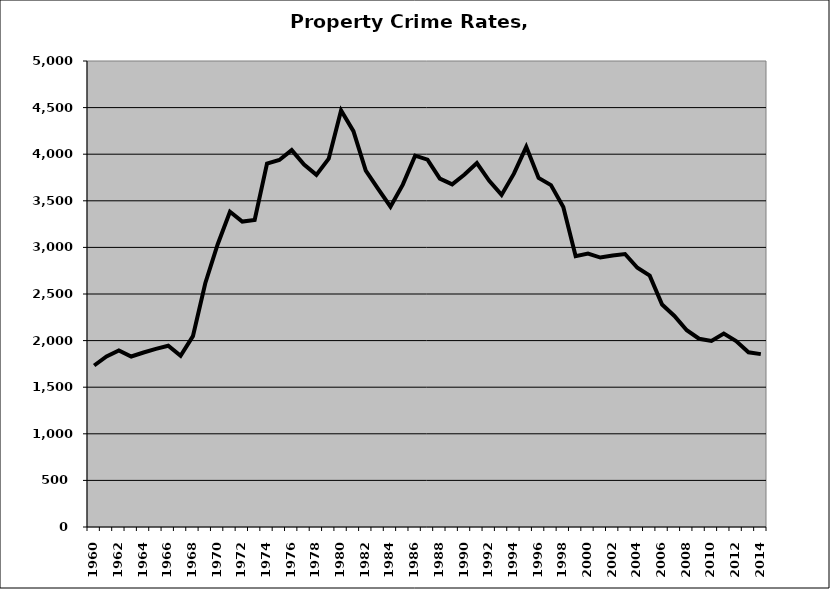
| Category | Property |
|---|---|
| 1960.0 | 1732.787 |
| 1961.0 | 1829.825 |
| 1962.0 | 1894.986 |
| 1963.0 | 1829.453 |
| 1964.0 | 1872.11 |
| 1965.0 | 1911.272 |
| 1966.0 | 1944.957 |
| 1967.0 | 1837.339 |
| 1968.0 | 2047.943 |
| 1969.0 | 2616.017 |
| 1970.0 | 3031.523 |
| 1971.0 | 3382.24 |
| 1972.0 | 3276.852 |
| 1973.0 | 3293.636 |
| 1974.0 | 3899.249 |
| 1975.0 | 3937.439 |
| 1976.0 | 4043.803 |
| 1977.0 | 3887.981 |
| 1978.0 | 3778.36 |
| 1979.0 | 3952.044 |
| 1980.0 | 4468.811 |
| 1981.0 | 4247.445 |
| 1982.0 | 3824.041 |
| 1983.0 | 3627.098 |
| 1984.0 | 3436.364 |
| 1985.0 | 3673.234 |
| 1986.0 | 3984.447 |
| 1987.0 | 3942.084 |
| 1988.0 | 3738.238 |
| 1989.0 | 3676.331 |
| 1990.0 | 3781.379 |
| 1991.0 | 3905.486 |
| 1992.0 | 3714.714 |
| 1993.0 | 3563.33 |
| 1994.0 | 3791.174 |
| 1995.0 | 4079.45 |
| 1996.0 | 3745.332 |
| 1997.0 | 3668.43 |
| 1998.0 | 3432.465 |
| 1999.0 | 2905.089 |
| 2000.0 | 2933.723 |
| 2001.0 | 2891.219 |
| 2002.0 | 2913.208 |
| 2003.0 | 2929.115 |
| 2004.0 | 2781.011 |
| 2005.0 | 2697.418 |
| 2006.0 | 2386.896 |
| 2007.0 | 2264.236 |
| 2008.0 | 2111.416 |
| 2009.0 | 2019.665 |
| 2010.0 | 1995.813 |
| 2011.0 | 2075.777 |
| 2012.0 | 1994.56 |
| 2013.0 | 1874.33 |
| 2014.0 | 1854.798 |